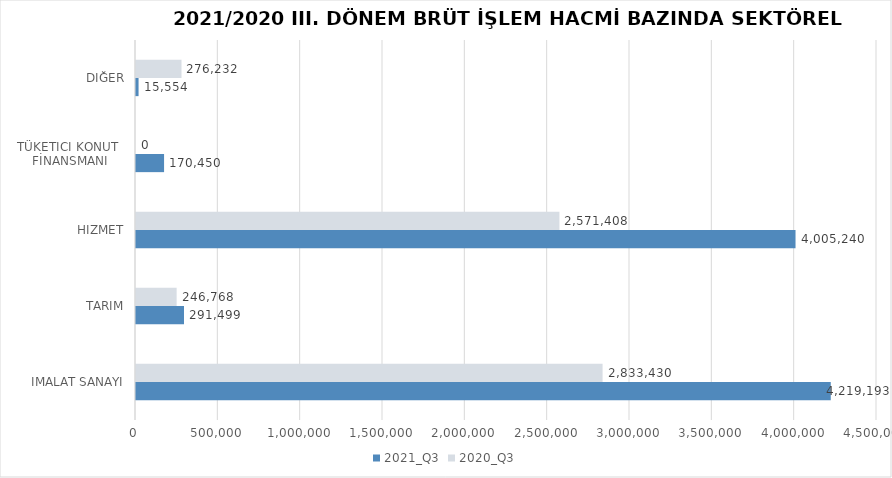
| Category | 2021_Q3 | 2020_Q3 |
|---|---|---|
| İMALAT SANAYİ | 4219193.223 | 2833430.156 |
| TARIM | 291499.276 | 246767.964 |
| HİZMET | 4005239.943 | 2571407.774 |
| TÜKETİCİ KONUT 
FİNANSMANI | 170450 | 0 |
| DİĞER | 15554 | 276232 |